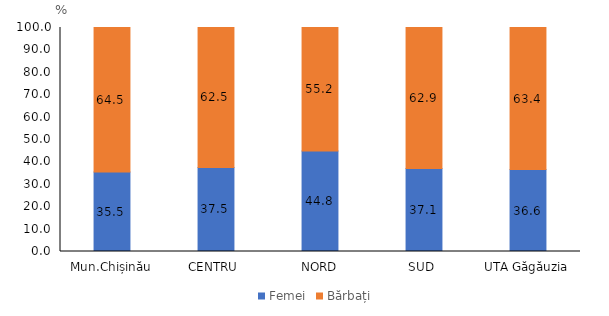
| Category | Femei | Bărbați |
|---|---|---|
| Mun.Chișinău | 35.484 | 64.516 |
| CENTRU  | 37.517 | 62.483 |
| NORD | 44.815 | 55.185 |
| SUD  | 37.054 | 62.946 |
| UTA Găgăuzia | 36.552 | 63.448 |